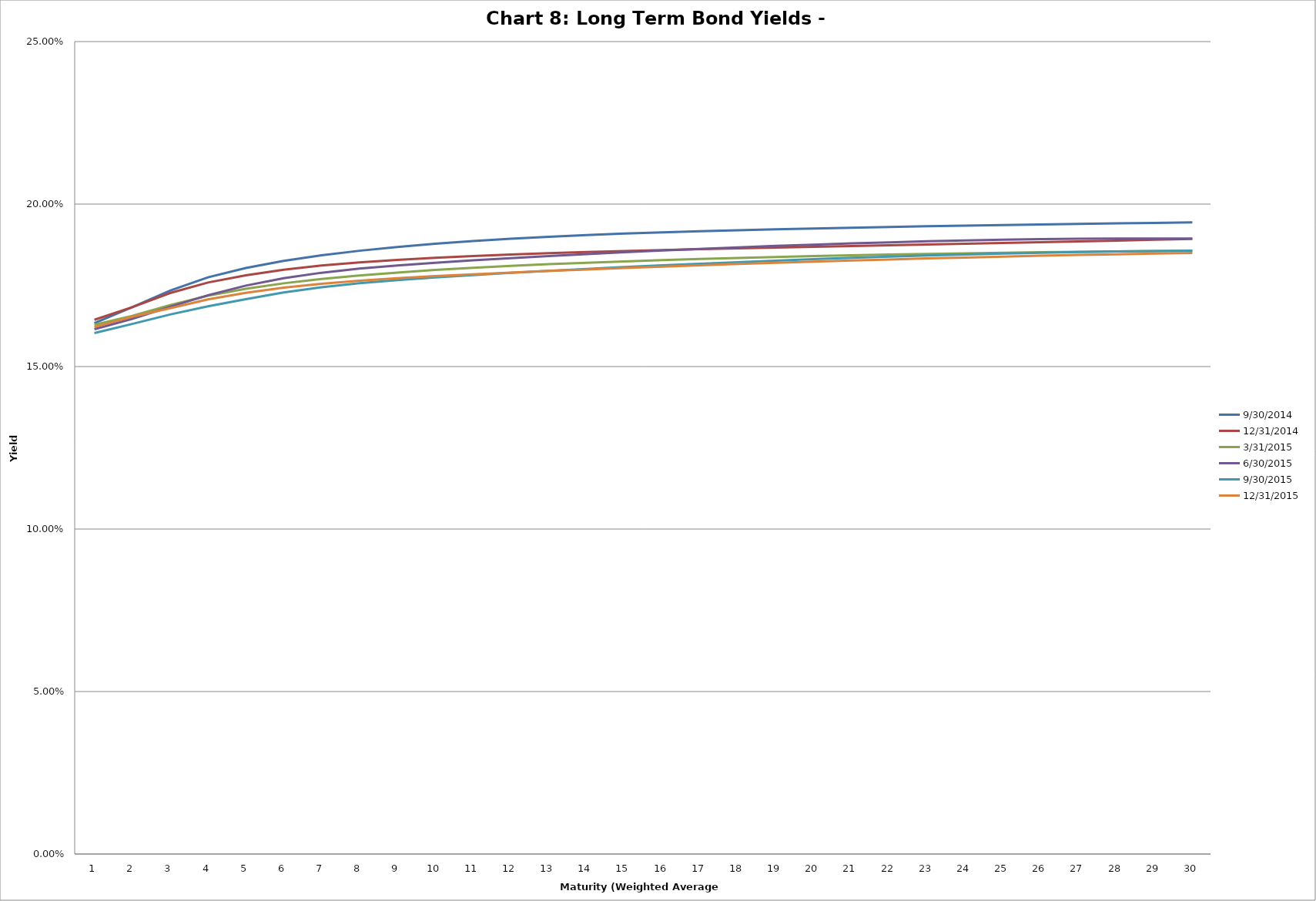
| Category | 9/30/2014 | 12/31/2014 | 3/31/2015 | 6/30/2015 | 9/30/2015 | 12/31/2015 |
|---|---|---|---|---|---|---|
| 0 | 0.163 | 0.164 | 0.163 | 0.161 | 0.16 | 0.162 |
| 1 | 0.168 | 0.168 | 0.166 | 0.165 | 0.163 | 0.165 |
| 2 | 0.173 | 0.173 | 0.169 | 0.168 | 0.166 | 0.168 |
| 3 | 0.177 | 0.176 | 0.172 | 0.172 | 0.169 | 0.171 |
| 4 | 0.18 | 0.178 | 0.174 | 0.175 | 0.171 | 0.173 |
| 5 | 0.183 | 0.18 | 0.176 | 0.177 | 0.173 | 0.174 |
| 6 | 0.184 | 0.181 | 0.177 | 0.179 | 0.174 | 0.175 |
| 7 | 0.186 | 0.182 | 0.178 | 0.18 | 0.176 | 0.176 |
| 8 | 0.187 | 0.183 | 0.179 | 0.181 | 0.177 | 0.177 |
| 9 | 0.188 | 0.183 | 0.18 | 0.182 | 0.177 | 0.178 |
| 10 | 0.189 | 0.184 | 0.18 | 0.183 | 0.178 | 0.178 |
| 11 | 0.189 | 0.184 | 0.181 | 0.183 | 0.179 | 0.179 |
| 12 | 0.19 | 0.185 | 0.181 | 0.184 | 0.179 | 0.179 |
| 13 | 0.19 | 0.185 | 0.182 | 0.185 | 0.18 | 0.18 |
| 14 | 0.191 | 0.186 | 0.182 | 0.185 | 0.181 | 0.18 |
| 15 | 0.191 | 0.186 | 0.183 | 0.186 | 0.181 | 0.181 |
| 16 | 0.192 | 0.186 | 0.183 | 0.186 | 0.182 | 0.181 |
| 17 | 0.192 | 0.186 | 0.183 | 0.187 | 0.182 | 0.182 |
| 18 | 0.192 | 0.187 | 0.184 | 0.187 | 0.183 | 0.182 |
| 19 | 0.193 | 0.187 | 0.184 | 0.188 | 0.183 | 0.182 |
| 20 | 0.193 | 0.187 | 0.184 | 0.188 | 0.183 | 0.183 |
| 21 | 0.193 | 0.187 | 0.184 | 0.188 | 0.184 | 0.183 |
| 22 | 0.193 | 0.188 | 0.185 | 0.189 | 0.184 | 0.183 |
| 23 | 0.193 | 0.188 | 0.185 | 0.189 | 0.184 | 0.184 |
| 24 | 0.194 | 0.188 | 0.185 | 0.189 | 0.185 | 0.184 |
| 25 | 0.194 | 0.188 | 0.185 | 0.189 | 0.185 | 0.184 |
| 26 | 0.194 | 0.189 | 0.185 | 0.189 | 0.185 | 0.184 |
| 27 | 0.194 | 0.189 | 0.185 | 0.189 | 0.185 | 0.185 |
| 28 | 0.194 | 0.189 | 0.186 | 0.189 | 0.186 | 0.185 |
| 29 | 0.194 | 0.189 | 0.186 | 0.189 | 0.186 | 0.185 |